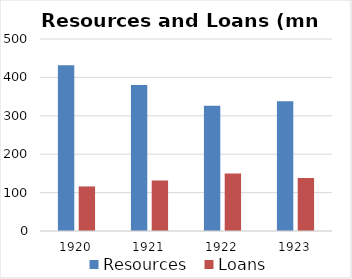
| Category | Resources | Loans |
|---|---|---|
| 1920.0 | 431.405 | 116.024 |
| 1921.0 | 380.503 | 131.508 |
| 1922.0 | 326.203 | 149.717 |
| 1923.0 | 338.058 | 138.203 |